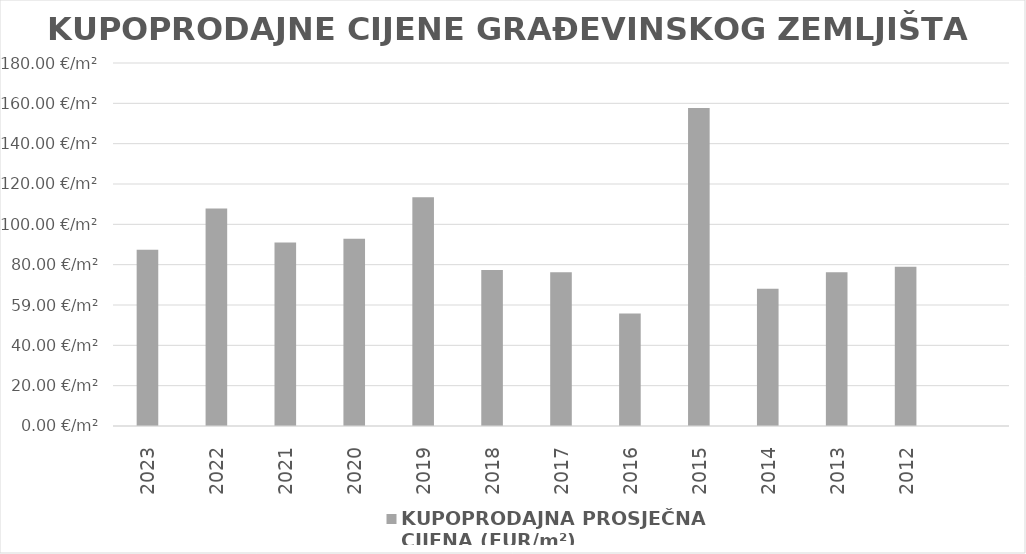
| Category | KUPOPRODAJNA PROSJEČNA 
CIJENA (EUR/m²) |
|---|---|
| 2023 | 1900-03-27 09:58:27 |
| 2022 | 1900-04-16 20:59:03 |
| 2021 | 1900-03-30 23:20:37 |
| 2020 | 1900-04-01 21:39:30 |
| 2019 | 1900-04-22 11:12:56 |
| 2018 | 1900-03-17 09:44:46 |
| 2017 | 1900-03-16 05:42:22 |
| 2016 | 1900-02-24 19:04:04 |
| 2015 | 1900-06-05 16:43:21 |
| 2014 | 1900-03-08 02:13:06 |
| 2013 | 1900-03-16 05:08:41 |
| 2012 | 1900-03-18 23:34:55 |